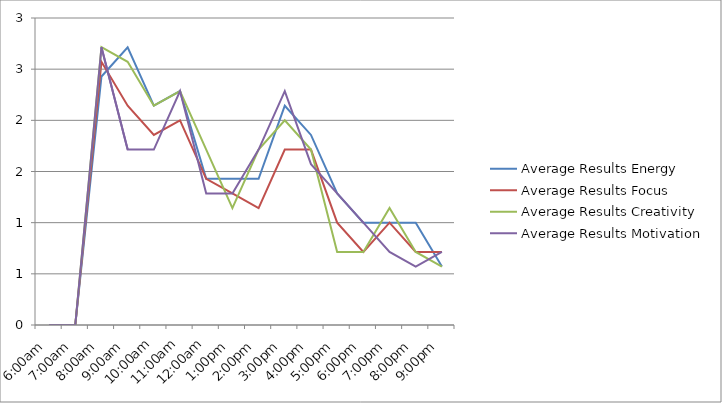
| Category | Average Results Energy | Average Results Focus | Average Results Creativity | Average Results Motivation |
|---|---|---|---|---|
| 6:00am | 0 | 0 | 0 | 0 |
| 7:00am | 0 | 0 | 0 | 0 |
| 8:00am | 2.429 | 2.571 | 2.714 | 2.714 |
| 9:00am | 2.714 | 2.143 | 2.571 | 1.714 |
| 10:00am | 2.143 | 1.857 | 2.143 | 1.714 |
| 11:00am | 2.286 | 2 | 2.286 | 2.286 |
| 12:00am | 1.429 | 1.429 | 1.714 | 1.286 |
| 1:00pm | 1.429 | 1.286 | 1.143 | 1.286 |
| 2:00pm | 1.429 | 1.143 | 1.714 | 1.714 |
| 3:00pm | 2.143 | 1.714 | 2 | 2.286 |
| 4:00pm | 1.857 | 1.714 | 1.714 | 1.571 |
| 5:00pm | 1.286 | 1 | 0.714 | 1.286 |
| 6:00pm | 1 | 0.714 | 0.714 | 1 |
| 7:00pm | 1 | 1 | 1.143 | 0.714 |
| 8:00pm | 1 | 0.714 | 0.714 | 0.571 |
| 9:00pm | 0.571 | 0.714 | 0.571 | 0.714 |